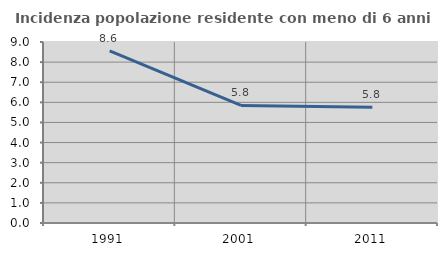
| Category | Incidenza popolazione residente con meno di 6 anni |
|---|---|
| 1991.0 | 8.555 |
| 2001.0 | 5.848 |
| 2011.0 | 5.761 |